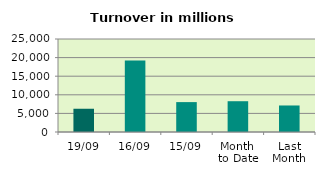
| Category | Series 0 |
|---|---|
| 19/09 | 6249.57 |
| 16/09 | 19228.667 |
| 15/09 | 8037.876 |
| Month 
to Date | 8274.949 |
| Last
Month | 7128.729 |